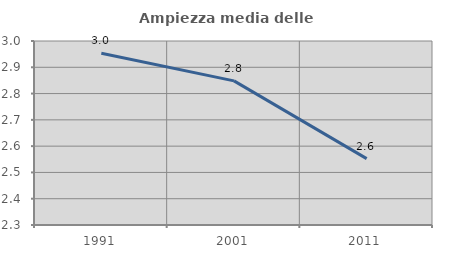
| Category | Ampiezza media delle famiglie |
|---|---|
| 1991.0 | 2.954 |
| 2001.0 | 2.848 |
| 2011.0 | 2.553 |